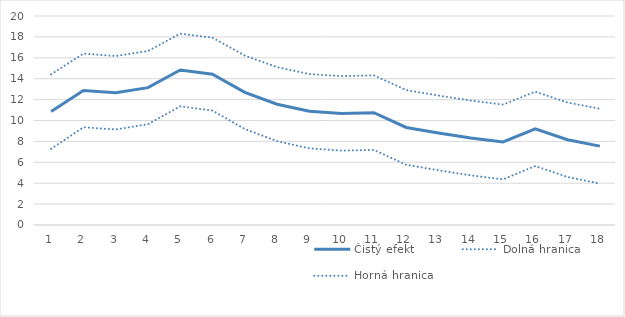
| Category | Čistý efekt | Dolná hranica | Horná hranica |
|---|---|---|---|
| 1.0 | 10.856 | 7.29 | 14.423 |
| 2.0 | 12.875 | 9.352 | 16.399 |
| 3.0 | 12.656 | 9.141 | 16.171 |
| 4.0 | 13.146 | 9.644 | 16.649 |
| 5.0 | 14.834 | 11.36 | 18.309 |
| 6.0 | 14.434 | 10.945 | 17.923 |
| 7.0 | 12.696 | 9.179 | 16.214 |
| 8.0 | 11.56 | 8.019 | 15.101 |
| 9.0 | 10.89 | 7.336 | 14.443 |
| 10.0 | 10.681 | 7.117 | 14.244 |
| 11.0 | 10.752 | 7.185 | 14.32 |
| 12.0 | 9.337 | 5.76 | 12.914 |
| 13.0 | 8.813 | 5.236 | 12.389 |
| 14.0 | 8.325 | 4.749 | 11.902 |
| 15.0 | 7.945 | 4.368 | 11.522 |
| 16.0 | 9.197 | 5.641 | 12.754 |
| 17.0 | 8.157 | 4.591 | 11.723 |
| 18.0 | 7.546 | 3.967 | 11.126 |